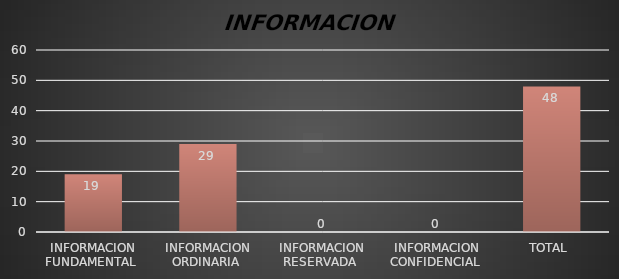
| Category | Series 1 |
|---|---|
| INFORMACION FUNDAMENTAL  | 19 |
| INFORMACION ORDINARIA  | 29 |
| INFORMACION RESERVADA  | 0 |
| INFORMACION CONFIDENCIAL  | 0 |
| TOTAL  | 48 |